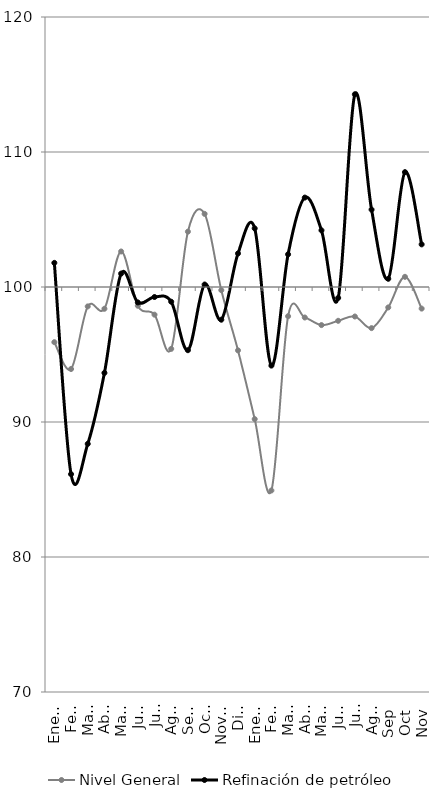
| Category | Nivel General | Refinación de petróleo |
|---|---|---|
| 0 | 95.913 | 101.787 |
| 1 | 93.925 | 86.136 |
| 2 | 98.562 | 88.38 |
| 3 | 98.388 | 93.638 |
| 4 | 102.631 | 100.993 |
| 5 | 98.61 | 98.858 |
| 6 | 97.951 | 99.259 |
| 7 | 95.417 | 98.909 |
| 8 | 104.099 | 95.318 |
| 9 | 105.418 | 100.184 |
| 10 | 99.767 | 97.577 |
| 11 | 95.305 | 102.483 |
| 12 | 90.217 | 104.342 |
| 13 | 84.928 | 94.177 |
| 14 | 97.836 | 102.422 |
| 15 | 97.741 | 106.624 |
| 16 | 97.179 | 104.196 |
| 17 | 97.496 | 99.19 |
| 18 | 97.814 | 114.275 |
| 19 | 96.954 | 105.733 |
| 20 | 98.486 | 100.608 |
| 21 | 100.754 | 108.508 |
| 22 | 98.401 | 103.156 |